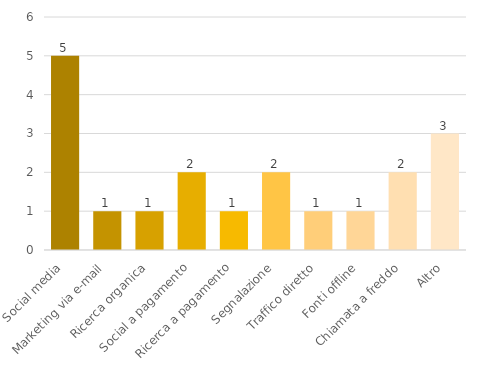
| Category | Series 0 |
|---|---|
| Social media | 5 |
| Marketing via e-mail | 1 |
| Ricerca organica | 1 |
| Social a pagamento | 2 |
| Ricerca a pagamento | 1 |
| Segnalazione | 2 |
| Traffico diretto | 1 |
| Fonti offline | 1 |
| Chiamata a freddo | 2 |
| Altro | 3 |